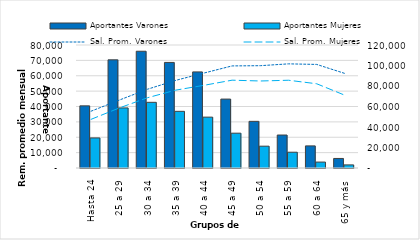
| Category | Aportantes Varones | Aportantes Mujeres |
|---|---|---|
| Hasta 24 | 60639 | 29337 |
| 25 a 29 | 105527 | 58599 |
| 30 a 34 | 113905 | 64079 |
| 35 a 39 | 102991 | 55275 |
| 40 a 44 | 93759 | 49632 |
| 45 a 49 | 67231 | 33968 |
| 50 a 54 | 45514 | 21291 |
| 55 a 59 | 32174 | 15401 |
| 60 a 64 | 21560 | 5790 |
| 65 y más | 9300 | 3022 |